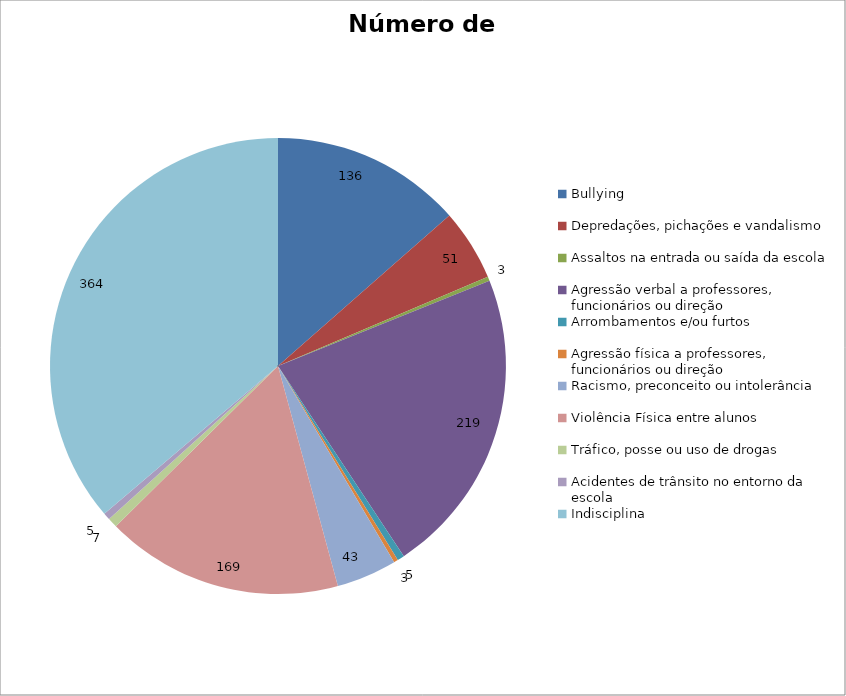
| Category | Número de Casos |
|---|---|
| Bullying | 136 |
| Depredações, pichações e vandalismo | 51 |
| Assaltos na entrada ou saída da escola | 3 |
| Agressão verbal a professores, funcionários ou direção | 219 |
| Arrombamentos e/ou furtos | 5 |
| Agressão física a professores, funcionários ou direção | 3 |
| Racismo, preconceito ou intolerância | 43 |
| Violência Física entre alunos | 169 |
| Tráfico, posse ou uso de drogas | 7 |
| Acidentes de trânsito no entorno da escola | 5 |
| Indisciplina | 364 |